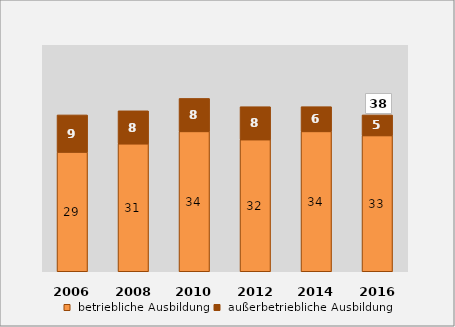
| Category |  betriebliche Ausbildung |  außerbetriebliche Ausbildung |
|---|---|---|
| 2006.0 | 29 | 9 |
| 2008.0 | 31 | 8 |
| 2010.0 | 34 | 8 |
| 2012.0 | 32 | 8 |
| 2014.0 | 34 | 6 |
| 2016.0 | 33 | 5 |